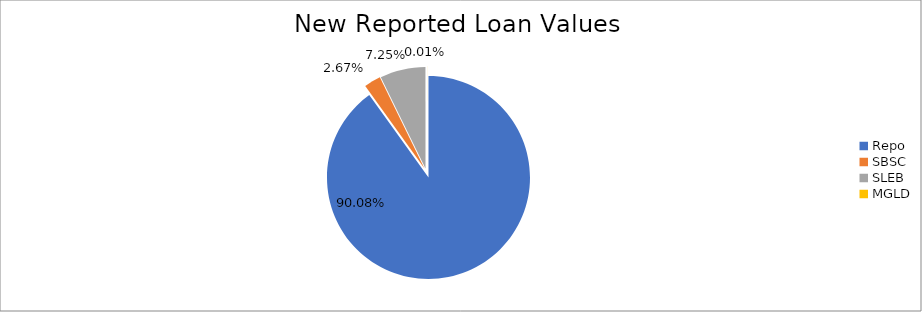
| Category | Series 0 |
|---|---|
| Repo | 5520783.56 |
| SBSC | 163465.486 |
| SLEB | 444075.473 |
| MGLD | 440.965 |